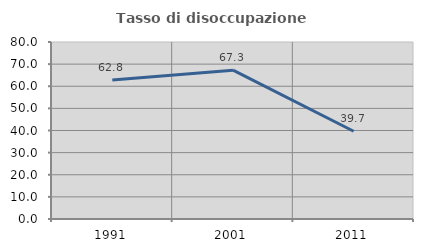
| Category | Tasso di disoccupazione giovanile  |
|---|---|
| 1991.0 | 62.782 |
| 2001.0 | 67.257 |
| 2011.0 | 39.655 |